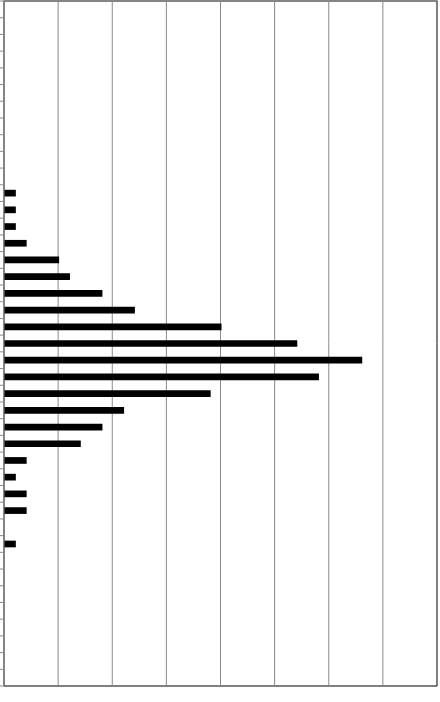
| Category | Series 0 |
|---|---|
| 0 | 0 |
| 1 | 0 |
| 2 | 0 |
| 3 | 0 |
| 4 | 0 |
| 5 | 0 |
| 6 | 0 |
| 7 | 0 |
| 8 | 0 |
| 9 | 0 |
| 10 | 0 |
| 11 | 1 |
| 12 | 1 |
| 13 | 1 |
| 14 | 2 |
| 15 | 5 |
| 16 | 6 |
| 17 | 9 |
| 18 | 12 |
| 19 | 20 |
| 20 | 27 |
| 21 | 33 |
| 22 | 29 |
| 23 | 19 |
| 24 | 11 |
| 25 | 9 |
| 26 | 7 |
| 27 | 2 |
| 28 | 1 |
| 29 | 2 |
| 30 | 2 |
| 31 | 0 |
| 32 | 1 |
| 33 | 0 |
| 34 | 0 |
| 35 | 0 |
| 36 | 0 |
| 37 | 0 |
| 38 | 0 |
| 39 | 0 |
| 40 | 0 |